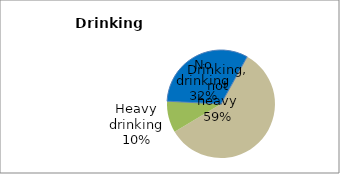
| Category | Series 0 |
|---|---|
| No drinking | 32.211 |
| Drinking, not heavy | 58.396 |
| Heavy drinking | 9.393 |